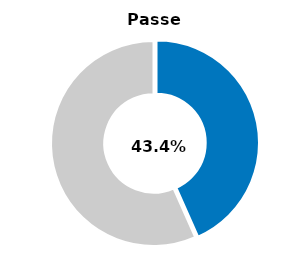
| Category | Series 0 |
|---|---|
| Passed | 0.434 |
| Other | 0.566 |